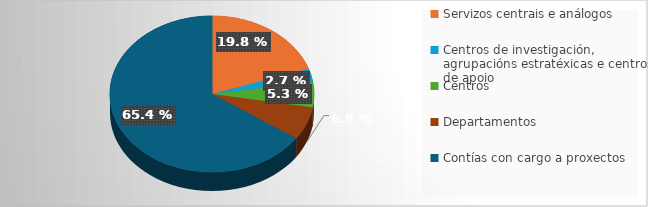
| Category | Series 0 | Series 1 |
|---|---|---|
| Servizos centrais e análogos | 144435.37 |  |
| Centros de investigación, agrupacións estratéxicas e centros de apoio | 19773.94 |  |
| Centros | 38673.44 |  |
| Departamentos | 49870.83 |  |
| Contías con cargo a proxectos | 478189.69 |  |